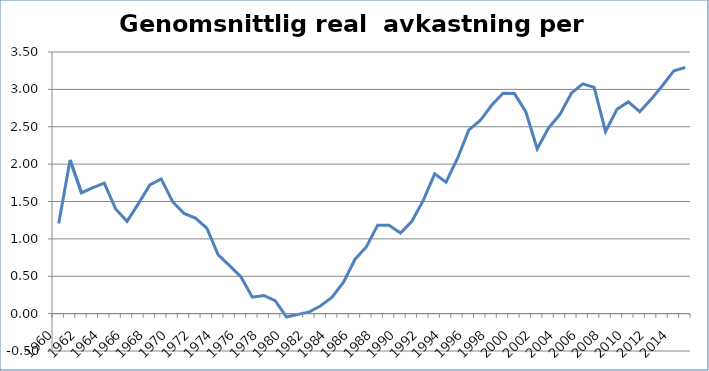
| Category | Genomsnittlig real  avkastning per år, % |
|---|---|
| 1960.0 | 1.207 |
| 1961.0 | 2.054 |
| 1962.0 | 1.616 |
| 1963.0 | 1.686 |
| 1964.0 | 1.746 |
| 1965.0 | 1.401 |
| 1966.0 | 1.234 |
| 1967.0 | 1.471 |
| 1968.0 | 1.721 |
| 1969.0 | 1.802 |
| 1970.0 | 1.498 |
| 1971.0 | 1.341 |
| 1972.0 | 1.278 |
| 1973.0 | 1.143 |
| 1974.0 | 0.785 |
| 1975.0 | 0.641 |
| 1976.0 | 0.49 |
| 1977.0 | 0.22 |
| 1978.0 | 0.243 |
| 1979.0 | 0.173 |
| 1980.0 | -0.046 |
| 1981.0 | -0.01 |
| 1982.0 | 0.024 |
| 1983.0 | 0.105 |
| 1984.0 | 0.219 |
| 1985.0 | 0.422 |
| 1986.0 | 0.724 |
| 1987.0 | 0.893 |
| 1988.0 | 1.183 |
| 1989.0 | 1.183 |
| 1990.0 | 1.079 |
| 1991.0 | 1.236 |
| 1992.0 | 1.514 |
| 1993.0 | 1.87 |
| 1994.0 | 1.759 |
| 1995.0 | 2.075 |
| 1996.0 | 2.457 |
| 1997.0 | 2.583 |
| 1998.0 | 2.787 |
| 1999.0 | 2.948 |
| 2000.0 | 2.944 |
| 2001.0 | 2.701 |
| 2002.0 | 2.205 |
| 2003.0 | 2.484 |
| 2004.0 | 2.665 |
| 2005.0 | 2.949 |
| 2006.0 | 3.074 |
| 2007.0 | 3.027 |
| 2008.0 | 2.437 |
| 2009.0 | 2.735 |
| 2010.0 | 2.832 |
| 2011.0 | 2.702 |
| 2012.0 | 2.866 |
| 2013.0 | 3.052 |
| 2014.0 | 3.25 |